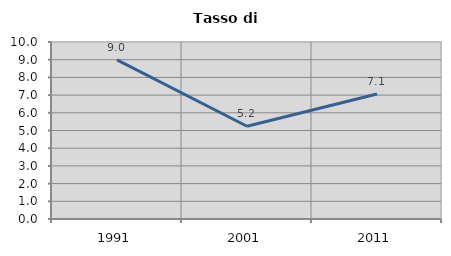
| Category | Tasso di disoccupazione   |
|---|---|
| 1991.0 | 8.99 |
| 2001.0 | 5.24 |
| 2011.0 | 7.063 |